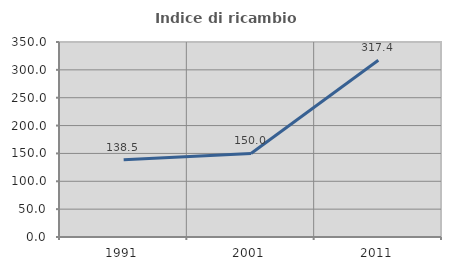
| Category | Indice di ricambio occupazionale  |
|---|---|
| 1991.0 | 138.462 |
| 2001.0 | 150 |
| 2011.0 | 317.391 |